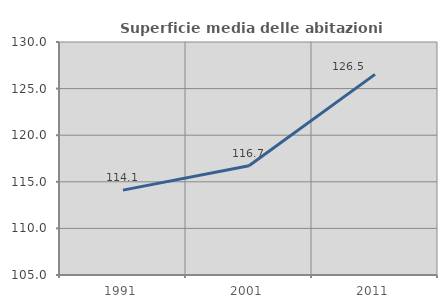
| Category | Superficie media delle abitazioni occupate |
|---|---|
| 1991.0 | 114.104 |
| 2001.0 | 116.73 |
| 2011.0 | 126.526 |